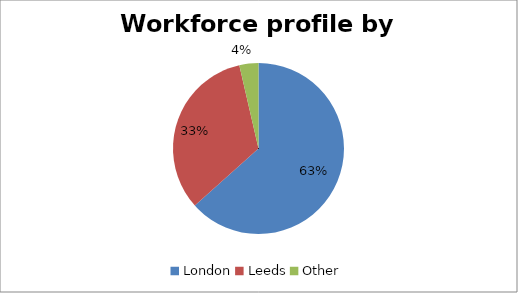
| Category | Series 0 | Series 1 |
|---|---|---|
| London | 1266 | 0.63 |
| Leeds | 660 | 0.33 |
| Other | 72 | 0.04 |